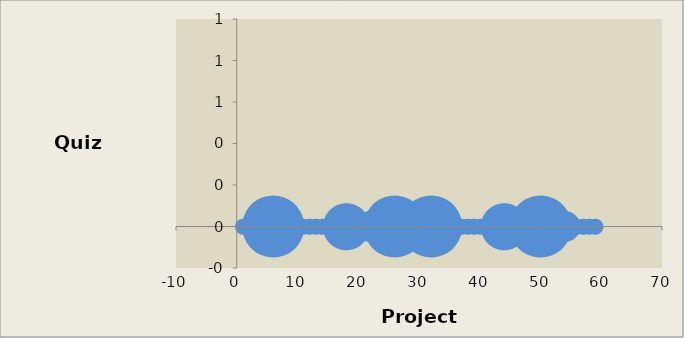
| Category | Mine |
|---|---|
| 25.0 | 9.444 |
| 0.0 | 6.4 |
| 18.0 | 9 |
| 0.0 | 8.818 |
| 20.0 | 9.3 |
| 25.0 | 10 |
| 23.0 | 9.4 |
| 15.0 | 8.5 |
| 18.0 | 9.455 |
| 5.0 | 7 |
| 10.0 | 8.75 |
| 0.0 | 7.818 |
| 23.0 | 9 |
| 8.0 | 10 |
| 25.0 | 9.923 |
| 25.0 | 9 |
| 25.0 | 10.071 |
| 20.0 | 9.3 |
| 0.0 | 8 |
| 23.0 | 10 |
| 25.0 | 9.952 |
| 23.0 | 10 |
| 23.0 | 8.875 |
| 20.0 | 8.833 |
| 20.0 | 9.615 |
| 25.0 | 10 |
| 23.0 | 9.077 |
| 25.0 | 9.917 |
| 20.0 | 6.2 |
| 17.0 | 9.778 |
| 25.0 | 10.2 |
| 25.0 | 10 |
| 0.0 | 7.5 |
| 20.0 | 9.2 |
| 20.0 | 8.778 |
| 13.0 | 7.667 |
| 25.0 | 9.308 |
| 0.0 | 8.333 |
| 25.0 | 9.556 |
| 23.0 | 9.25 |
| 20.0 | 9.455 |
| 0.0 | 10.111 |
| 25.0 | 9.5 |
| 20.0 | 9.3 |
| 18.0 | 9.4 |
| 20.0 | 10.4 |
| 25.0 | 9.8 |
| 25.0 | 10.2 |
| 20.0 | 10 |
| 25.0 | 10 |
| 25.0 | 10.083 |
| 13.0 | 10 |
| 0.0 | 9 |
| 20.0 | 10 |
| 25.0 | 8.938 |
| 20.0 | 10.25 |
| 25.0 | 9.235 |
| 20.0 | 9.167 |
| 0.0 | 10 |